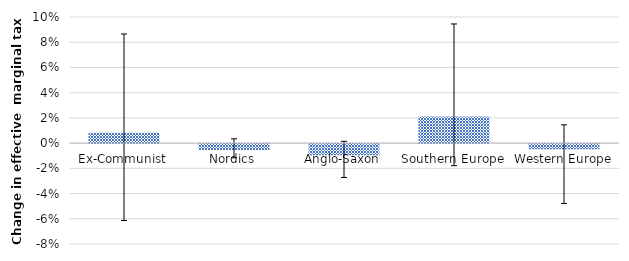
| Category | Change |
|---|---|
| Ex-Communist | 0.008 |
| Nordics | -0.005 |
| Anglo-Saxon | -0.009 |
| Southern Europe | 0.021 |
| Western Europe | -0.004 |